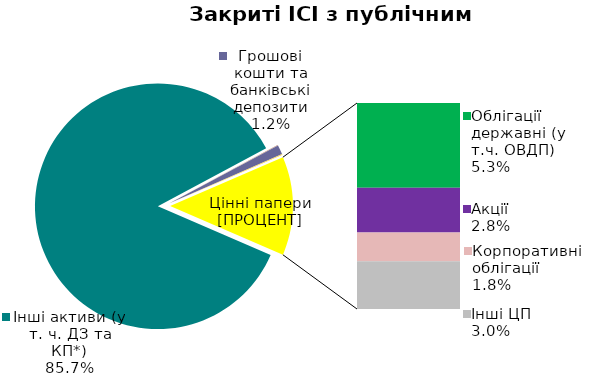
| Category | Series 0 |
|---|---|
| Інші активи (у т. ч. ДЗ та КП*) | 0.857 |
| Нерухомість | 0 |
| Грошові кошти та банківські депозити | 0.012 |
| Банківські метали | 0.001 |
| Облігації державні (у т.ч. ОВДП) | 0.053 |
| Облігації місцевих позик | 0 |
| Акції | 0.028 |
| Корпоративні облігації | 0.018 |
| Векселі | 0 |
| Інші ЦП | 0.03 |